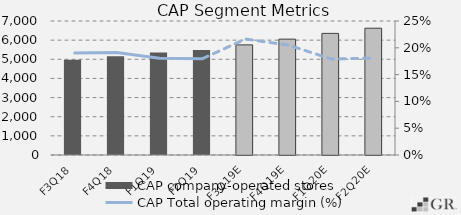
| Category | CAP company-operated stores |
|---|---|
|  F3Q18  | 4979 |
|  F4Q18  | 5159 |
|  F1Q19  | 5350 |
|  F2Q19  | 5483 |
|  F3Q19E  | 5753 |
|  F4Q19E  | 6053 |
|  F1Q20E  | 6353 |
|  F2Q20E  | 6623 |